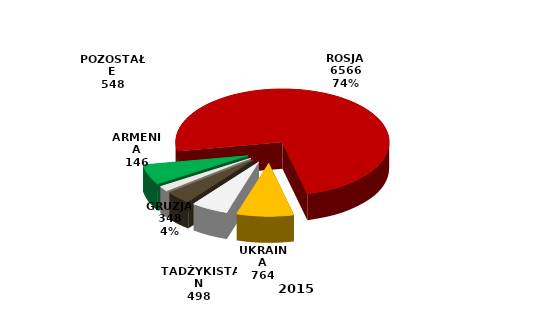
| Category | Series 0 |
|---|---|
| ROSJA | 6566 |
| UKRAINA | 764 |
| TADŻYKISTAN | 498 |
| GRUZJA | 348 |
| ARMENIA | 146 |
| POZOSTAŁE | 548 |